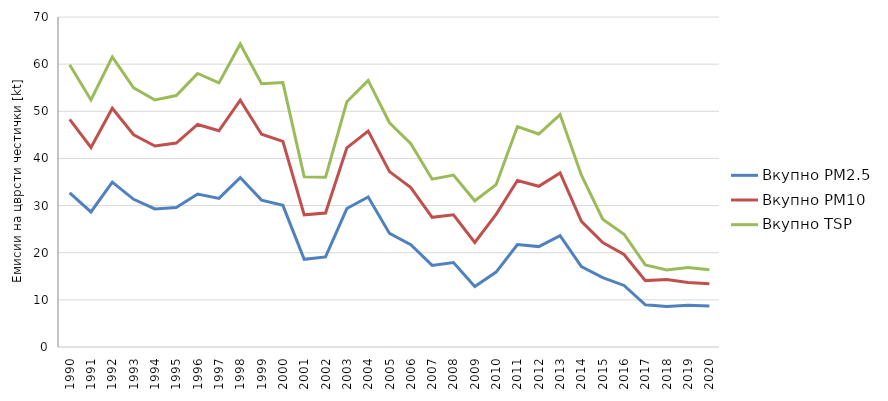
| Category | Вкупно PM2.5 | Вкупно PM10 | Вкупно TSP |
|---|---|---|---|
| 1990 | 32.705 | 48.284 | 59.88 |
| 1991 | 28.646 | 42.344 | 52.405 |
| 1992 | 34.987 | 50.631 | 61.537 |
| 1993 | 31.327 | 45.029 | 54.983 |
| 1994 | 29.298 | 42.625 | 52.407 |
| 1995 | 29.581 | 43.252 | 53.33 |
| 1996 | 32.448 | 47.206 | 58.024 |
| 1997 | 31.532 | 45.858 | 56.013 |
| 1998 | 35.936 | 52.365 | 64.269 |
| 1999 | 31.162 | 45.131 | 55.835 |
| 2000 | 30.052 | 43.623 | 56.091 |
| 2001 | 18.598 | 28.037 | 36.086 |
| 2002 | 19.109 | 28.406 | 35.992 |
| 2003 | 29.369 | 42.24 | 52.01 |
| 2004 | 31.812 | 45.823 | 56.549 |
| 2005 | 24.097 | 37.208 | 47.57 |
| 2006 | 21.707 | 33.805 | 43.138 |
| 2007 | 17.306 | 27.513 | 35.596 |
| 2008 | 17.903 | 28.05 | 36.454 |
| 2009 | 12.841 | 22.174 | 31.009 |
| 2010 | 15.894 | 28.149 | 34.437 |
| 2011 | 21.741 | 35.306 | 46.757 |
| 2012 | 21.298 | 34.089 | 45.177 |
| 2013 | 23.633 | 36.905 | 49.305 |
| 2014 | 17.078 | 26.659 | 36.439 |
| 2015 | 14.735 | 22.164 | 27.094 |
| 2016 | 13.053 | 19.617 | 23.919 |
| 2017 | 8.958 | 14.081 | 17.408 |
| 2018 | 8.613 | 14.301 | 16.351 |
| 2019 | 8.865 | 13.696 | 16.873 |
| 2020 | 8.709 | 13.432 | 16.41 |